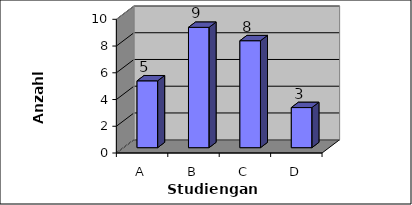
| Category | StudGang |
|---|---|
| A | 5 |
| B | 9 |
| C | 8 |
| D | 3 |